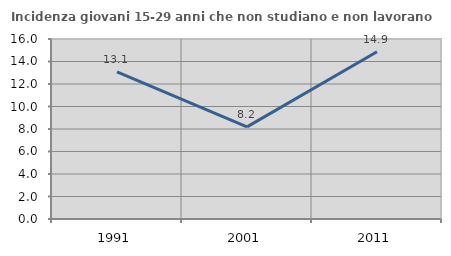
| Category | Incidenza giovani 15-29 anni che non studiano e non lavorano  |
|---|---|
| 1991.0 | 13.084 |
| 2001.0 | 8.186 |
| 2011.0 | 14.861 |